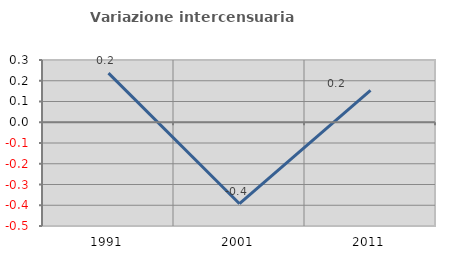
| Category | Variazione intercensuaria annua |
|---|---|
| 1991.0 | 0.237 |
| 2001.0 | -0.393 |
| 2011.0 | 0.153 |